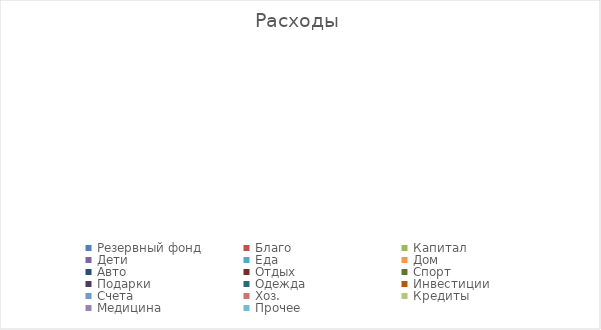
| Category | Series 0 |
|---|---|
| Резервный фонд | 0 |
| Благо | 0 |
| Капитал | 0 |
| Дети | 0 |
| Еда | 0 |
| Дом | 0 |
| Авто | 0 |
| Отдых | 0 |
| Спорт | 0 |
| Подарки | 0 |
| Одежда | 0 |
| Инвестиции | 0 |
| Счета | 0 |
| Хоз. | 0 |
| Кредиты | 0 |
| Медицина | 0 |
| Прочее | 0 |